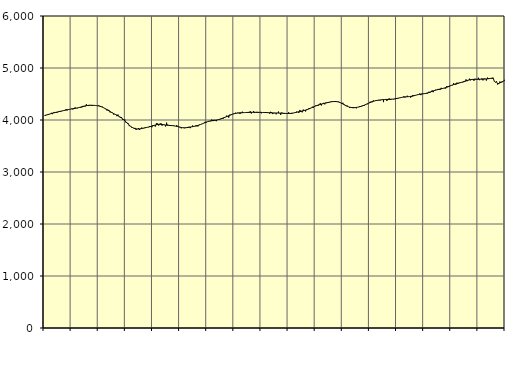
| Category | Piggar | Series 1 |
|---|---|---|
| nan | 4090.4 | 4087.29 |
| 87.0 | 4084.9 | 4092.76 |
| 87.0 | 4097.1 | 4098.31 |
| 87.0 | 4101.6 | 4104.67 |
| 87.0 | 4108.8 | 4111.05 |
| 87.0 | 4118 | 4117.55 |
| 87.0 | 4138.2 | 4123.99 |
| 87.0 | 4112.6 | 4130.26 |
| 87.0 | 4145.4 | 4136.24 |
| 87.0 | 4154.3 | 4141.77 |
| 87.0 | 4144.3 | 4147.01 |
| 87.0 | 4139.6 | 4151.98 |
| nan | 4155.3 | 4156.8 |
| 88.0 | 4174.3 | 4161.6 |
| 88.0 | 4158.8 | 4166.54 |
| 88.0 | 4166.6 | 4171.66 |
| 88.0 | 4180.6 | 4176.81 |
| 88.0 | 4180.2 | 4181.89 |
| 88.0 | 4184.3 | 4186.86 |
| 88.0 | 4207.5 | 4191.64 |
| 88.0 | 4183.9 | 4196.22 |
| 88.0 | 4203.3 | 4200.52 |
| 88.0 | 4206.9 | 4204.66 |
| 88.0 | 4206.8 | 4208.69 |
| nan | 4219.5 | 4212.63 |
| 89.0 | 4203.3 | 4216.49 |
| 89.0 | 4214.9 | 4220.23 |
| 89.0 | 4243 | 4224 |
| 89.0 | 4225.9 | 4227.98 |
| 89.0 | 4225.1 | 4232.31 |
| 89.0 | 4240.3 | 4237.08 |
| 89.0 | 4247.2 | 4242.38 |
| 89.0 | 4237.6 | 4248.14 |
| 89.0 | 4242.8 | 4254.27 |
| 89.0 | 4270.6 | 4260.44 |
| 89.0 | 4260.8 | 4266.34 |
| nan | 4261.1 | 4271.64 |
| 90.0 | 4302.5 | 4276.04 |
| 90.0 | 4287.4 | 4279.42 |
| 90.0 | 4268.4 | 4281.66 |
| 90.0 | 4290.4 | 4282.79 |
| 90.0 | 4285.9 | 4283.08 |
| 90.0 | 4268.8 | 4282.74 |
| 90.0 | 4282.9 | 4281.93 |
| 90.0 | 4276.2 | 4280.87 |
| 90.0 | 4276.8 | 4279.46 |
| 90.0 | 4278.3 | 4277.37 |
| 90.0 | 4275.8 | 4274.36 |
| nan | 4282.1 | 4270.18 |
| 91.0 | 4259.5 | 4264.51 |
| 91.0 | 4259 | 4257.25 |
| 91.0 | 4256.8 | 4248.52 |
| 91.0 | 4235.6 | 4238.41 |
| 91.0 | 4230.3 | 4227.06 |
| 91.0 | 4209 | 4214.69 |
| 91.0 | 4186.1 | 4201.65 |
| 91.0 | 4201 | 4188.35 |
| 91.0 | 4188.7 | 4175.09 |
| 91.0 | 4147.2 | 4162.17 |
| 91.0 | 4153.6 | 4149.75 |
| nan | 4143.4 | 4137.72 |
| 92.0 | 4106.3 | 4126.14 |
| 92.0 | 4111 | 4114.93 |
| 92.0 | 4108.5 | 4103.82 |
| 92.0 | 4073.7 | 4092.64 |
| 92.0 | 4104 | 4081.11 |
| 92.0 | 4070.5 | 4068.85 |
| 92.0 | 4041 | 4055.46 |
| 92.0 | 4055.2 | 4040.48 |
| 92.0 | 4009.5 | 4023.53 |
| 92.0 | 4009 | 4004.79 |
| 92.0 | 4010.2 | 3984.64 |
| nan | 3952.3 | 3963.42 |
| 93.0 | 3946.6 | 3941.91 |
| 93.0 | 3934 | 3920.9 |
| 93.0 | 3881.5 | 3900.85 |
| 93.0 | 3879.3 | 3882.38 |
| 93.0 | 3856.5 | 3866.08 |
| 93.0 | 3847.7 | 3852.33 |
| 93.0 | 3842.6 | 3841.57 |
| 93.0 | 3848.8 | 3833.89 |
| 93.0 | 3812.3 | 3829.1 |
| 93.0 | 3825.3 | 3826.9 |
| 93.0 | 3843.6 | 3826.82 |
| nan | 3807.3 | 3828.55 |
| 94.0 | 3825.2 | 3831.67 |
| 94.0 | 3854.6 | 3835.64 |
| 94.0 | 3838.5 | 3840.3 |
| 94.0 | 3844 | 3845.28 |
| 94.0 | 3858.1 | 3850.19 |
| 94.0 | 3852.2 | 3855.09 |
| 94.0 | 3862.3 | 3859.99 |
| 94.0 | 3861.6 | 3864.93 |
| 94.0 | 3884.6 | 3870.23 |
| 94.0 | 3866.1 | 3876.13 |
| 94.0 | 3860.6 | 3882.51 |
| nan | 3904.1 | 3889.36 |
| 95.0 | 3895 | 3896.41 |
| 95.0 | 3874 | 3902.96 |
| 95.0 | 3936.6 | 3908.47 |
| 95.0 | 3933.3 | 3912.65 |
| 95.0 | 3893.4 | 3915.22 |
| 95.0 | 3927.9 | 3916.12 |
| 95.0 | 3937.3 | 3915.44 |
| 95.0 | 3890.7 | 3913.43 |
| 95.0 | 3915.5 | 3910.51 |
| 95.0 | 3912.3 | 3907.04 |
| 95.0 | 3876.4 | 3903.59 |
| nan | 3948.5 | 3900.53 |
| 96.0 | 3912.2 | 3897.98 |
| 96.0 | 3894.7 | 3896.13 |
| 96.0 | 3892.9 | 3894.77 |
| 96.0 | 3889.5 | 3893.42 |
| 96.0 | 3886.9 | 3891.85 |
| 96.0 | 3895.4 | 3889.73 |
| 96.0 | 3882.6 | 3886.63 |
| 96.0 | 3882 | 3882.48 |
| 96.0 | 3900.5 | 3877.48 |
| 96.0 | 3871.6 | 3871.97 |
| 96.0 | 3865 | 3866.43 |
| nan | 3866.4 | 3861.21 |
| 97.0 | 3839.8 | 3856.62 |
| 97.0 | 3851.1 | 3853.08 |
| 97.0 | 3845 | 3850.91 |
| 97.0 | 3841.8 | 3850.35 |
| 97.0 | 3854.9 | 3851.41 |
| 97.0 | 3857.9 | 3853.81 |
| 97.0 | 3867.4 | 3857.12 |
| 97.0 | 3868.3 | 3860.89 |
| 97.0 | 3843.7 | 3864.73 |
| 97.0 | 3866.5 | 3868.45 |
| 97.0 | 3894.3 | 3872.07 |
| nan | 3868.1 | 3875.79 |
| 98.0 | 3880.2 | 3879.91 |
| 98.0 | 3898.2 | 3884.68 |
| 98.0 | 3877.8 | 3890.29 |
| 98.0 | 3880.2 | 3896.91 |
| 98.0 | 3910.7 | 3904.41 |
| 98.0 | 3910.7 | 3912.71 |
| 98.0 | 3924.7 | 3921.59 |
| 98.0 | 3932.6 | 3930.85 |
| 98.0 | 3939.4 | 3940.37 |
| 98.0 | 3964.5 | 3949.8 |
| 98.0 | 3948.3 | 3958.63 |
| nan | 3965.5 | 3966.52 |
| 99.0 | 3981.3 | 3973.31 |
| 99.0 | 3976.5 | 3978.82 |
| 99.0 | 3974.8 | 3983.23 |
| 99.0 | 4009.5 | 3986.8 |
| 99.0 | 3978.4 | 3989.74 |
| 99.0 | 4003.9 | 3992.29 |
| 99.0 | 3999.6 | 3994.94 |
| 99.0 | 3976.8 | 3998.3 |
| 99.0 | 4004.4 | 4002.62 |
| 99.0 | 4004 | 4007.96 |
| 99.0 | 4005.8 | 4014.3 |
| nan | 4027.6 | 4021.56 |
| 0.0 | 4036.2 | 4029.47 |
| 0.0 | 4024.4 | 4037.78 |
| 0.0 | 4057.3 | 4046.39 |
| 0.0 | 4058.3 | 4055.15 |
| 0.0 | 4083.6 | 4063.96 |
| 0.0 | 4066 | 4072.99 |
| 0.0 | 4045.9 | 4082.12 |
| 0.0 | 4103.2 | 4091.16 |
| 0.0 | 4099 | 4099.92 |
| 0.0 | 4108.3 | 4108.1 |
| 0.0 | 4119.9 | 4115.49 |
| nan | 4129.3 | 4121.85 |
| 1.0 | 4139.5 | 4127.07 |
| 1.0 | 4127.1 | 4131.19 |
| 1.0 | 4140.7 | 4134.18 |
| 1.0 | 4132.5 | 4136.25 |
| 1.0 | 4116.1 | 4137.72 |
| 1.0 | 4134.1 | 4138.81 |
| 1.0 | 4159.6 | 4139.94 |
| 1.0 | 4137.1 | 4141.24 |
| 1.0 | 4141.4 | 4142.5 |
| 1.0 | 4144.8 | 4143.79 |
| 1.0 | 4150 | 4145.03 |
| nan | 4139.1 | 4146.05 |
| 2.0 | 4140.9 | 4146.84 |
| 2.0 | 4168.1 | 4147.43 |
| 2.0 | 4125.6 | 4147.82 |
| 2.0 | 4144.8 | 4148.02 |
| 2.0 | 4171.4 | 4148.1 |
| 2.0 | 4134 | 4148.04 |
| 2.0 | 4149.5 | 4147.75 |
| 2.0 | 4156.8 | 4147.36 |
| 2.0 | 4138.8 | 4146.9 |
| 2.0 | 4144 | 4146.32 |
| 2.0 | 4156.3 | 4145.77 |
| nan | 4129.1 | 4145.31 |
| 3.0 | 4144.7 | 4144.95 |
| 3.0 | 4151.9 | 4144.68 |
| 3.0 | 4145 | 4144.38 |
| 3.0 | 4144.4 | 4143.83 |
| 3.0 | 4148 | 4142.82 |
| 3.0 | 4138.8 | 4141.41 |
| 3.0 | 4123.4 | 4139.77 |
| 3.0 | 4157.2 | 4138.04 |
| 3.0 | 4150.9 | 4136.5 |
| 3.0 | 4114 | 4135.38 |
| 3.0 | 4137.9 | 4134.7 |
| nan | 4134.4 | 4134.43 |
| 4.0 | 4109.8 | 4134.35 |
| 4.0 | 4136.3 | 4134.21 |
| 4.0 | 4161.9 | 4133.94 |
| 4.0 | 4129.3 | 4133.4 |
| 4.0 | 4099.8 | 4132.53 |
| 4.0 | 4143.9 | 4131.34 |
| 4.0 | 4126.4 | 4129.93 |
| 4.0 | 4117.7 | 4128.31 |
| 4.0 | 4123.6 | 4126.59 |
| 4.0 | 4122 | 4125.26 |
| 4.0 | 4118.9 | 4124.54 |
| nan | 4149.9 | 4124.55 |
| 5.0 | 4117.9 | 4125.61 |
| 5.0 | 4116.4 | 4127.63 |
| 5.0 | 4135.5 | 4130.35 |
| 5.0 | 4133.6 | 4133.83 |
| 5.0 | 4136.3 | 4138.08 |
| 5.0 | 4134.5 | 4142.84 |
| 5.0 | 4160.8 | 4147.83 |
| 5.0 | 4156 | 4152.96 |
| 5.0 | 4137 | 4158.11 |
| 5.0 | 4193.4 | 4163.15 |
| 5.0 | 4171.7 | 4168.14 |
| nan | 4148 | 4173.21 |
| 6.0 | 4200.8 | 4178.47 |
| 6.0 | 4189.4 | 4184.21 |
| 6.0 | 4164.9 | 4190.65 |
| 6.0 | 4190 | 4197.82 |
| 6.0 | 4210.6 | 4205.63 |
| 6.0 | 4226.1 | 4214.18 |
| 6.0 | 4219.8 | 4223.29 |
| 6.0 | 4231.3 | 4232.66 |
| 6.0 | 4255.1 | 4242.22 |
| 6.0 | 4238.1 | 4251.7 |
| 6.0 | 4255.6 | 4260.76 |
| nan | 4280.4 | 4269.45 |
| 7.0 | 4279 | 4277.72 |
| 7.0 | 4270.7 | 4285.37 |
| 7.0 | 4300.4 | 4292.52 |
| 7.0 | 4322.8 | 4299.18 |
| 7.0 | 4280 | 4305.33 |
| 7.0 | 4316.3 | 4311.02 |
| 7.0 | 4329.8 | 4316.4 |
| 7.0 | 4300.8 | 4321.66 |
| 7.0 | 4334.4 | 4326.82 |
| 7.0 | 4335.5 | 4331.9 |
| 7.0 | 4327.3 | 4336.93 |
| nan | 4335 | 4341.8 |
| 8.0 | 4351.5 | 4346.23 |
| 8.0 | 4356.4 | 4350.1 |
| 8.0 | 4358.5 | 4353.15 |
| 8.0 | 4348.2 | 4355.07 |
| 8.0 | 4350.4 | 4355.59 |
| 8.0 | 4354.2 | 4354.53 |
| 8.0 | 4348.4 | 4351.58 |
| 8.0 | 4353.8 | 4346.63 |
| 8.0 | 4346.7 | 4339.74 |
| 8.0 | 4333.9 | 4331.01 |
| 8.0 | 4312 | 4320.74 |
| nan | 4331.5 | 4309.36 |
| 9.0 | 4289.7 | 4297.41 |
| 9.0 | 4281 | 4285.42 |
| 9.0 | 4265.5 | 4273.98 |
| 9.0 | 4274.8 | 4263.56 |
| 9.0 | 4253.7 | 4254.63 |
| 9.0 | 4232.4 | 4247.43 |
| 9.0 | 4248.3 | 4242.08 |
| 9.0 | 4242.7 | 4238.66 |
| 9.0 | 4228.5 | 4237.08 |
| 9.0 | 4246.1 | 4237.18 |
| 9.0 | 4244.6 | 4238.78 |
| nan | 4224.6 | 4241.62 |
| 10.0 | 4246.2 | 4245.39 |
| 10.0 | 4249.2 | 4250.02 |
| 10.0 | 4267.3 | 4255.5 |
| 10.0 | 4257.6 | 4261.76 |
| 10.0 | 4273.5 | 4268.8 |
| 10.0 | 4283.8 | 4276.69 |
| 10.0 | 4273.9 | 4285.46 |
| 10.0 | 4288.2 | 4294.93 |
| 10.0 | 4308.5 | 4304.9 |
| 10.0 | 4303.8 | 4315.18 |
| 10.0 | 4324.2 | 4325.43 |
| nan | 4349.4 | 4335.32 |
| 11.0 | 4353.1 | 4344.59 |
| 11.0 | 4341.5 | 4352.9 |
| 11.0 | 4376.5 | 4360.07 |
| 11.0 | 4364.8 | 4366.22 |
| 11.0 | 4366.5 | 4371.46 |
| 11.0 | 4368.5 | 4375.77 |
| 11.0 | 4383.2 | 4379.39 |
| 11.0 | 4385.2 | 4382.53 |
| 11.0 | 4375.6 | 4385.26 |
| 11.0 | 4389.2 | 4387.66 |
| 11.0 | 4397.9 | 4389.79 |
| nan | 4343.5 | 4391.54 |
| 12.0 | 4391.5 | 4392.9 |
| 12.0 | 4404.3 | 4393.94 |
| 12.0 | 4366.7 | 4394.78 |
| 12.0 | 4398.5 | 4395.47 |
| 12.0 | 4416.7 | 4396.31 |
| 12.0 | 4384.7 | 4397.47 |
| 12.0 | 4405.2 | 4399.01 |
| 12.0 | 4401.5 | 4401.08 |
| 12.0 | 4398 | 4403.79 |
| 12.0 | 4401.5 | 4407.06 |
| 12.0 | 4415.7 | 4410.81 |
| nan | 4409.4 | 4414.97 |
| 13.0 | 4423.5 | 4419.59 |
| 13.0 | 4422.5 | 4424.58 |
| 13.0 | 4433.3 | 4429.54 |
| 13.0 | 4430.6 | 4434.19 |
| 13.0 | 4436.2 | 4438.1 |
| 13.0 | 4455.8 | 4441.19 |
| 13.0 | 4434.2 | 4443.58 |
| 13.0 | 4444.6 | 4445.39 |
| 13.0 | 4466.6 | 4446.91 |
| 13.0 | 4445.9 | 4448.61 |
| 13.0 | 4452 | 4450.81 |
| nan | 4430.9 | 4453.73 |
| 14.0 | 4443.2 | 4457.54 |
| 14.0 | 4479.8 | 4462.13 |
| 14.0 | 4463.9 | 4467.4 |
| 14.0 | 4474.3 | 4473.11 |
| 14.0 | 4478.5 | 4478.86 |
| 14.0 | 4487.8 | 4484.33 |
| 14.0 | 4494.9 | 4489.24 |
| 14.0 | 4508.2 | 4493.42 |
| 14.0 | 4477.8 | 4496.98 |
| 14.0 | 4506.8 | 4500.08 |
| 14.0 | 4500.7 | 4503.15 |
| nan | 4505.6 | 4506.58 |
| 15.0 | 4517.1 | 4510.66 |
| 15.0 | 4507.3 | 4515.55 |
| 15.0 | 4510.4 | 4521.36 |
| 15.0 | 4542.6 | 4528.04 |
| 15.0 | 4520.4 | 4535.38 |
| 15.0 | 4545.6 | 4543.11 |
| 15.0 | 4568.3 | 4550.95 |
| 15.0 | 4535.2 | 4558.7 |
| 15.0 | 4577 | 4566.05 |
| 15.0 | 4581.4 | 4572.88 |
| 15.0 | 4576.7 | 4579.07 |
| nan | 4597.1 | 4584.66 |
| 16.0 | 4578.7 | 4589.74 |
| 16.0 | 4581.1 | 4594.57 |
| 16.0 | 4618.6 | 4599.31 |
| 16.0 | 4599.7 | 4604.24 |
| 16.0 | 4611.8 | 4609.71 |
| 16.0 | 4611.3 | 4615.91 |
| 16.0 | 4605.1 | 4622.87 |
| 16.0 | 4651.6 | 4630.57 |
| 16.0 | 4632.9 | 4638.9 |
| 16.0 | 4636.1 | 4647.53 |
| 16.0 | 4663 | 4656.3 |
| nan | 4663.9 | 4665.03 |
| 17.0 | 4668.2 | 4673.53 |
| 17.0 | 4708.9 | 4681.47 |
| 17.0 | 4681.9 | 4688.69 |
| 17.0 | 4676.8 | 4695.17 |
| 17.0 | 4718.3 | 4701.06 |
| 17.0 | 4697.5 | 4706.63 |
| 17.0 | 4717 | 4712.19 |
| 17.0 | 4723.3 | 4717.94 |
| 17.0 | 4720.4 | 4724.17 |
| 17.0 | 4725 | 4731.01 |
| 17.0 | 4728 | 4738.29 |
| nan | 4734.2 | 4745.73 |
| 18.0 | 4780.6 | 4752.91 |
| 18.0 | 4746.6 | 4759.6 |
| 18.0 | 4762.4 | 4765.59 |
| 18.0 | 4794.8 | 4770.76 |
| 18.0 | 4763.4 | 4775.06 |
| 18.0 | 4788.4 | 4778.34 |
| 18.0 | 4785.6 | 4780.66 |
| 18.0 | 4753.4 | 4782.27 |
| 18.0 | 4792.3 | 4783.25 |
| 18.0 | 4787.7 | 4783.76 |
| 18.0 | 4775.2 | 4783.97 |
| nan | 4812.2 | 4784.06 |
| 19.0 | 4766.1 | 4784.2 |
| 19.0 | 4782.7 | 4784.46 |
| 19.0 | 4801 | 4785.05 |
| 19.0 | 4762 | 4785.9 |
| 19.0 | 4797.5 | 4786.97 |
| 19.0 | 4792.2 | 4788.39 |
| 19.0 | 4759 | 4790.17 |
| 19.0 | 4815.3 | 4792.25 |
| 19.0 | 4804.7 | 4794.69 |
| 19.0 | 4802.6 | 4797.44 |
| 19.0 | 4800 | 4800.63 |
| nan | 4791.6 | 4804.35 |
| 20.0 | 4812.3 | 4808.79 |
| 20.0 | 4742.4 | 4747.23 |
| 20.0 | 4722.4 | 4727.73 |
| 20.0 | 4744 | 4735.66 |
| 20.0 | 4683.1 | 4692.95 |
| 20.0 | 4692.7 | 4703.19 |
| 20.0 | 4739.7 | 4714.18 |
| 20.0 | 4716.4 | 4725.5 |
| 20.0 | 4727.2 | 4736.59 |
| 20.0 | 4749.1 | 4747.23 |
| 20.0 | 4772.1 | 4757.27 |